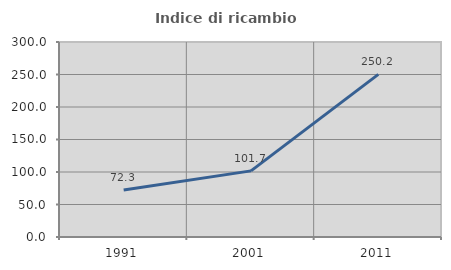
| Category | Indice di ricambio occupazionale  |
|---|---|
| 1991.0 | 72.271 |
| 2001.0 | 101.737 |
| 2011.0 | 250.187 |